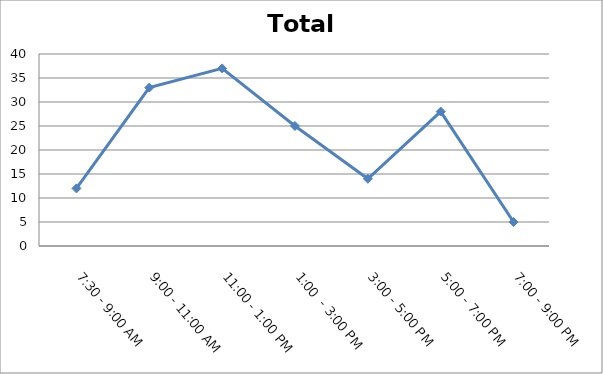
| Category | Total |
|---|---|
| 7:30 - 9:00 AM | 12 |
| 9:00 - 11:00 AM | 33 |
| 11:00 - 1:00 PM | 37 |
| 1:00  - 3:00 PM | 25 |
| 3:00 - 5:00 PM | 14 |
| 5:00 - 7:00 PM | 28 |
| 7:00 - 9:00 PM | 5 |